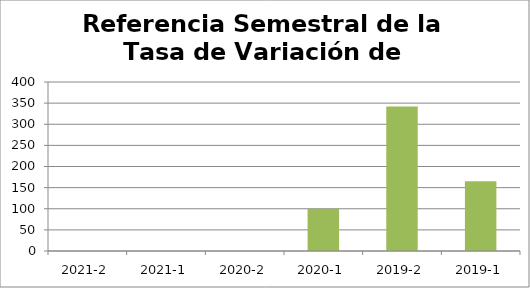
| Category | Referencia Semestral de la Tasa de Variación de Participantes |
|---|---|
| 2021-2 | 0 |
| 2021-1 | 0 |
| 2020-2 | 0 |
| 2020-1 | 100 |
| 2019-2 | 342 |
| 2019-1 | 165 |